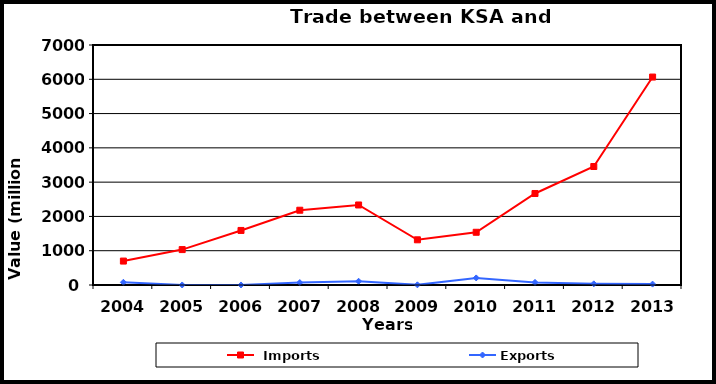
| Category |  Imports | Exports |
|---|---|---|
| 2004.0 | 698 | 79 |
| 2005.0 | 1033 | 1 |
| 2006.0 | 1591 | 1 |
| 2007.0 | 2181 | 71 |
| 2008.0 | 2334 | 109 |
| 2009.0 | 1318 | 5 |
| 2010.0 | 1538 | 206 |
| 2011.0 | 2669 | 76 |
| 2012.0 | 3456 | 34 |
| 2013.0 | 6065 | 26 |